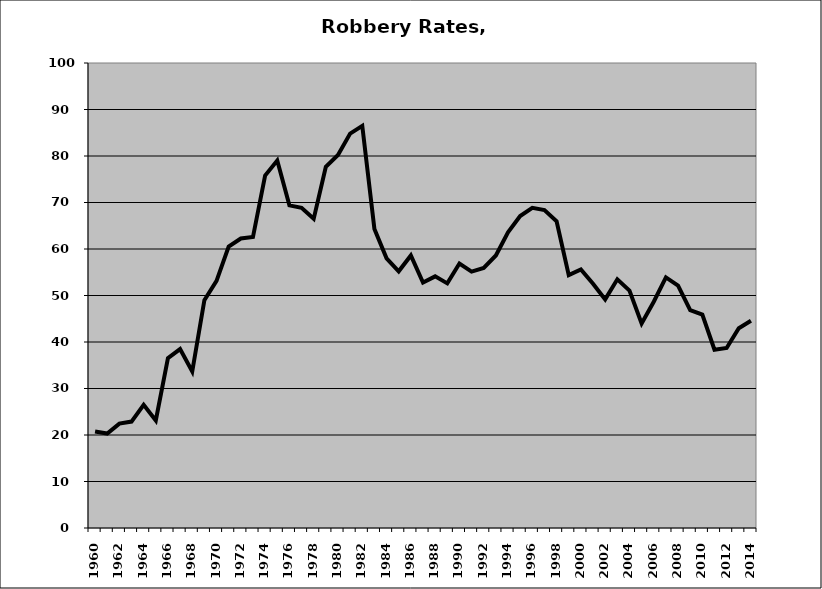
| Category | Robbery |
|---|---|
| 1960.0 | 20.772 |
| 1961.0 | 20.306 |
| 1962.0 | 22.441 |
| 1963.0 | 22.889 |
| 1964.0 | 26.512 |
| 1965.0 | 23.131 |
| 1966.0 | 36.508 |
| 1967.0 | 38.477 |
| 1968.0 | 33.656 |
| 1969.0 | 48.995 |
| 1970.0 | 53.15 |
| 1971.0 | 60.51 |
| 1972.0 | 62.256 |
| 1973.0 | 62.576 |
| 1974.0 | 75.789 |
| 1975.0 | 79.022 |
| 1976.0 | 69.381 |
| 1977.0 | 68.849 |
| 1978.0 | 66.488 |
| 1979.0 | 77.688 |
| 1980.0 | 80.207 |
| 1981.0 | 84.828 |
| 1982.0 | 86.486 |
| 1983.0 | 64.299 |
| 1984.0 | 57.99 |
| 1985.0 | 55.198 |
| 1986.0 | 58.619 |
| 1987.0 | 52.798 |
| 1988.0 | 54.11 |
| 1989.0 | 52.607 |
| 1990.0 | 56.882 |
| 1991.0 | 55.141 |
| 1992.0 | 55.929 |
| 1993.0 | 58.602 |
| 1994.0 | 63.574 |
| 1995.0 | 67.094 |
| 1996.0 | 68.85 |
| 1997.0 | 68.383 |
| 1998.0 | 65.952 |
| 1999.0 | 54.37 |
| 2000.0 | 55.616 |
| 2001.0 | 52.53 |
| 2002.0 | 49.164 |
| 2003.0 | 53.484 |
| 2004.0 | 51.059 |
| 2005.0 | 43.97 |
| 2006.0 | 48.665 |
| 2007.0 | 53.906 |
| 2008.0 | 52.139 |
| 2009.0 | 46.829 |
| 2010.0 | 45.877 |
| 2011.0 | 38.339 |
| 2012.0 | 38.706 |
| 2013.0 | 42.959 |
| 2014.0 | 44.582 |